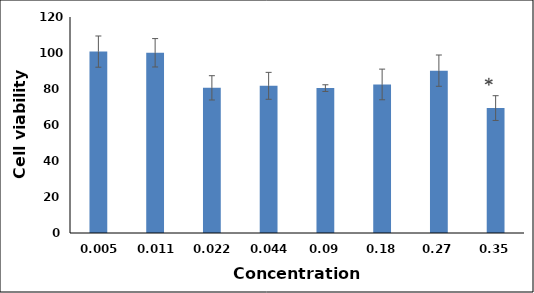
| Category | Series 0 |
|---|---|
| 0.005 | 100.776 |
| 0.011 | 100.122 |
| 0.022 | 80.641 |
| 0.044 | 81.763 |
| 0.09 | 80.492 |
| 0.18 | 82.529 |
| 0.27 | 90.194 |
| 0.35 | 69.405 |